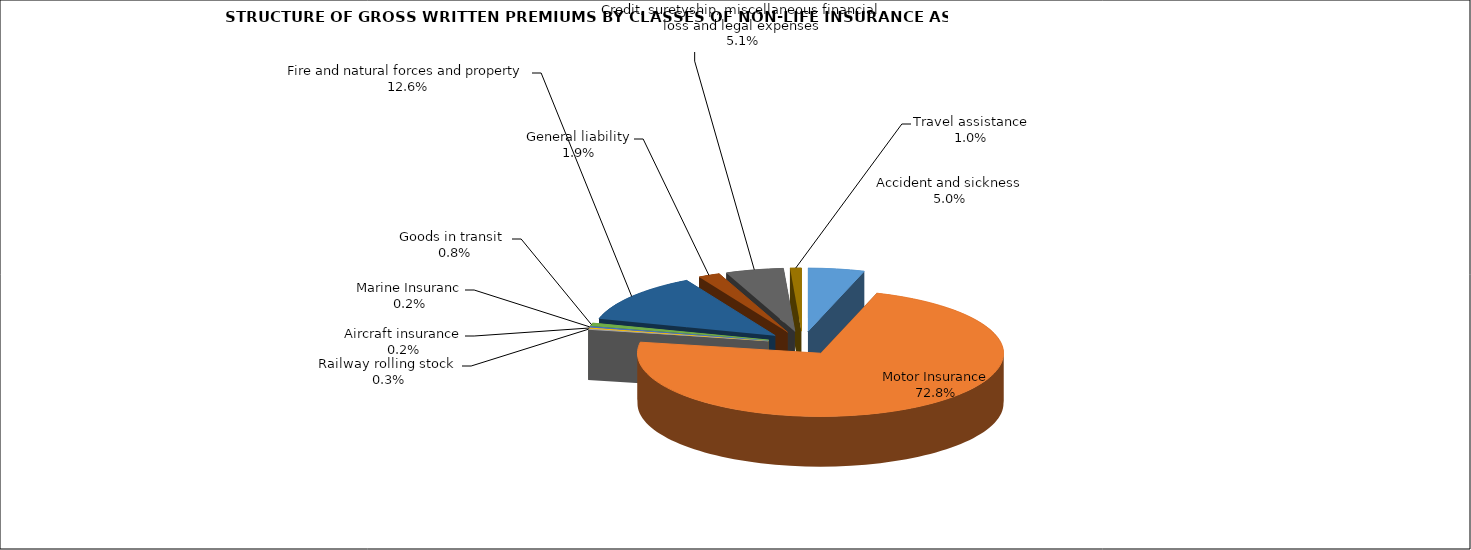
| Category | Accident and sickness |
|---|---|
| Accident and sickness | 0.05 |
| Motor Insurance | 0.728 |
| Railway rolling stock  | 0.003 |
| Aircraft insurance | 0.002 |
| Marine Insuranc | 0.002 |
| Goods in transit  | 0.008 |
| Fire and natural forces and property | 0.126 |
| General liability | 0.019 |
| Credit, suretyship, miscellaneous financial loss and legal expenses | 0.051 |
| Travel assistance | 0.01 |